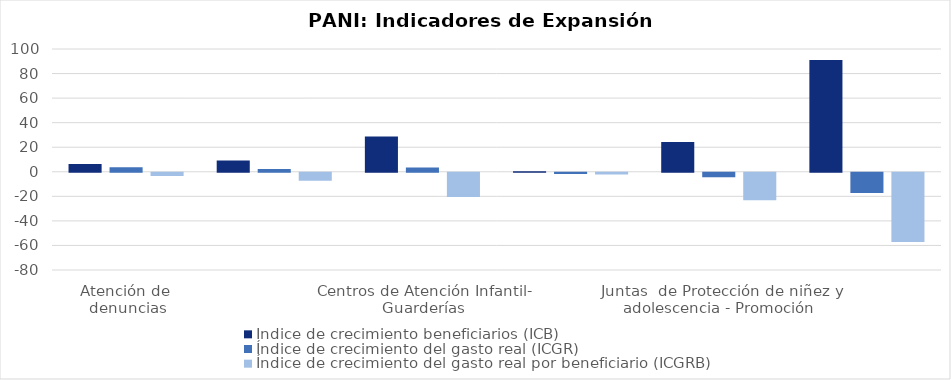
| Category | Índice de crecimiento beneficiarios (ICB)  | Índice de crecimiento del gasto real (ICGR)  | Índice de crecimiento del gasto real por beneficiario (ICGRB)  |
|---|---|---|---|
| Atención de 
denuncias | 6.387 | 3.686 | -2.538 |
| Total programa | 9.236 | 2.254 | -6.392 |
| Centros de Atención Infantil-
Guarderías | 28.799 | 3.438 | -19.69 |
| Protección y apoyo a los niños, niñas 
y adolescentes en los Albergues PANI | 0.42 | -0.951 | -1.365 |
| Juntas  de Protección de niñez y adolescencia - Promoción  | 24.196 | -3.579 | -22.364 |
| Juntas  de Protección de niñez y adolescencia - Prevención | 91.07 | -16.562 | -56.331 |